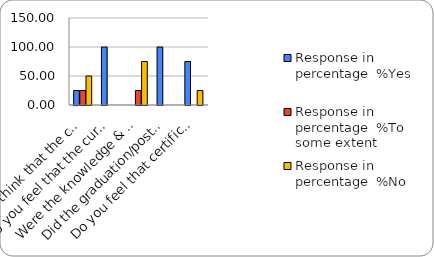
| Category | Response in percentage  |
|---|---|
| Do you think that the curriculum which you had during your graduation/post graduation has provided you with the knowledge & skills necessary to get employed/Self-employed or start own business? | 50 |
| Do you feel that the curriculum you studied is helpful in progression to higher studies? | 0 |
| Were the knowledge & skills acquired through the curriculum useful to you while working on the job?   | 75 |
| Did the graduation/post-graduation programme bring about any attitudinal and behavioural change in you? | 0 |
| Do you feel that certificate/ diploma courses offered by the college in addition to the curriculum lead to better career prospects? | 25 |